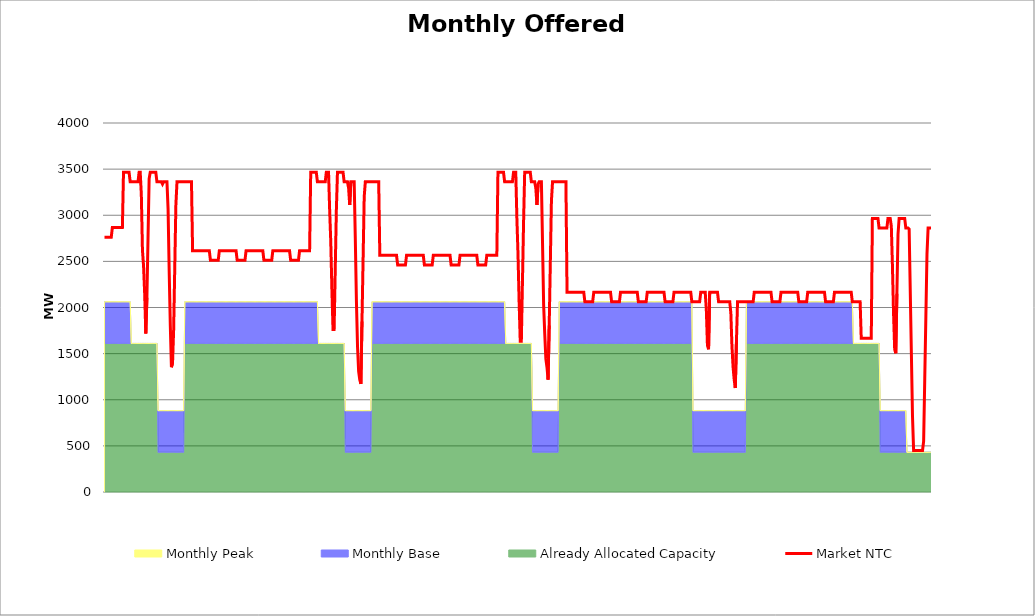
| Category | Market NTC |
|---|---|
| 0 | 2762 |
| 1 | 2762 |
| 2 | 2762 |
| 3 | 2762 |
| 4 | 2762 |
| 5 | 2762 |
| 6 | 2762 |
| 7 | 2866 |
| 8 | 2866 |
| 9 | 2866 |
| 10 | 2866 |
| 11 | 2866 |
| 12 | 2866 |
| 13 | 2866 |
| 14 | 2866 |
| 15 | 2866 |
| 16 | 2866 |
| 17 | 3466 |
| 18 | 3466 |
| 19 | 3466 |
| 20 | 3466 |
| 21 | 3466 |
| 22 | 3466 |
| 23 | 3362 |
| 24 | 3362 |
| 25 | 3362 |
| 26 | 3362 |
| 27 | 3362 |
| 28 | 3362 |
| 29 | 3362 |
| 30 | 3362 |
| 31 | 3466 |
| 32 | 3466 |
| 33 | 3224 |
| 34 | 2622 |
| 35 | 2450 |
| 36 | 2149 |
| 37 | 1719 |
| 38 | 2106 |
| 39 | 2751 |
| 40 | 3395 |
| 41 | 3466 |
| 42 | 3466 |
| 43 | 3466 |
| 44 | 3466 |
| 45 | 3466 |
| 46 | 3466 |
| 47 | 3362 |
| 48 | 3362 |
| 49 | 3362 |
| 50 | 3362 |
| 51 | 3362 |
| 52 | 3337 |
| 53 | 3362 |
| 54 | 3362 |
| 55 | 3362 |
| 56 | 3362 |
| 57 | 3066 |
| 58 | 2390 |
| 59 | 1804 |
| 60 | 1353 |
| 61 | 1398 |
| 62 | 1759 |
| 63 | 2435 |
| 64 | 3111 |
| 65 | 3362 |
| 66 | 3362 |
| 67 | 3362 |
| 68 | 3362 |
| 69 | 3362 |
| 70 | 3362 |
| 71 | 3362 |
| 72 | 3362 |
| 73 | 3362 |
| 74 | 3362 |
| 75 | 3362 |
| 76 | 3362 |
| 77 | 3362 |
| 78 | 3362 |
| 79 | 2616 |
| 80 | 2616 |
| 81 | 2616 |
| 82 | 2616 |
| 83 | 2616 |
| 84 | 2616 |
| 85 | 2616 |
| 86 | 2616 |
| 87 | 2616 |
| 88 | 2616 |
| 89 | 2616 |
| 90 | 2616 |
| 91 | 2616 |
| 92 | 2616 |
| 93 | 2616 |
| 94 | 2616 |
| 95 | 2512 |
| 96 | 2512 |
| 97 | 2512 |
| 98 | 2512 |
| 99 | 2512 |
| 100 | 2512 |
| 101 | 2512 |
| 102 | 2512 |
| 103 | 2616 |
| 104 | 2616 |
| 105 | 2616 |
| 106 | 2616 |
| 107 | 2616 |
| 108 | 2616 |
| 109 | 2616 |
| 110 | 2616 |
| 111 | 2616 |
| 112 | 2616 |
| 113 | 2616 |
| 114 | 2616 |
| 115 | 2616 |
| 116 | 2616 |
| 117 | 2616 |
| 118 | 2616 |
| 119 | 2512 |
| 120 | 2512 |
| 121 | 2512 |
| 122 | 2512 |
| 123 | 2512 |
| 124 | 2512 |
| 125 | 2512 |
| 126 | 2512 |
| 127 | 2616 |
| 128 | 2616 |
| 129 | 2616 |
| 130 | 2616 |
| 131 | 2616 |
| 132 | 2616 |
| 133 | 2616 |
| 134 | 2616 |
| 135 | 2616 |
| 136 | 2616 |
| 137 | 2616 |
| 138 | 2616 |
| 139 | 2616 |
| 140 | 2616 |
| 141 | 2616 |
| 142 | 2616 |
| 143 | 2512 |
| 144 | 2512 |
| 145 | 2512 |
| 146 | 2512 |
| 147 | 2512 |
| 148 | 2512 |
| 149 | 2512 |
| 150 | 2512 |
| 151 | 2616 |
| 152 | 2616 |
| 153 | 2616 |
| 154 | 2616 |
| 155 | 2616 |
| 156 | 2616 |
| 157 | 2616 |
| 158 | 2616 |
| 159 | 2616 |
| 160 | 2616 |
| 161 | 2616 |
| 162 | 2616 |
| 163 | 2616 |
| 164 | 2616 |
| 165 | 2616 |
| 166 | 2616 |
| 167 | 2512 |
| 168 | 2512 |
| 169 | 2512 |
| 170 | 2512 |
| 171 | 2512 |
| 172 | 2512 |
| 173 | 2512 |
| 174 | 2512 |
| 175 | 2616 |
| 176 | 2616 |
| 177 | 2616 |
| 178 | 2616 |
| 179 | 2616 |
| 180 | 2616 |
| 181 | 2616 |
| 182 | 2616 |
| 183 | 2616 |
| 184 | 2616 |
| 185 | 3466 |
| 186 | 3466 |
| 187 | 3466 |
| 188 | 3466 |
| 189 | 3466 |
| 190 | 3466 |
| 191 | 3362 |
| 192 | 3362 |
| 193 | 3362 |
| 194 | 3362 |
| 195 | 3362 |
| 196 | 3362 |
| 197 | 3362 |
| 198 | 3362 |
| 199 | 3466 |
| 200 | 3466 |
| 201 | 3466 |
| 202 | 3052 |
| 203 | 2708 |
| 204 | 2192 |
| 205 | 1762 |
| 206 | 1762 |
| 207 | 2407 |
| 208 | 3052 |
| 209 | 3466 |
| 210 | 3466 |
| 211 | 3466 |
| 212 | 3466 |
| 213 | 3466 |
| 214 | 3466 |
| 215 | 3362 |
| 216 | 3362 |
| 217 | 3362 |
| 218 | 3362 |
| 219 | 3292 |
| 220 | 3111 |
| 221 | 3362 |
| 222 | 3362 |
| 223 | 3362 |
| 224 | 3362 |
| 225 | 2751 |
| 226 | 2074 |
| 227 | 1578 |
| 228 | 1308 |
| 229 | 1218 |
| 230 | 1172 |
| 231 | 1849 |
| 232 | 2525 |
| 233 | 3201 |
| 234 | 3362 |
| 235 | 3362 |
| 236 | 3362 |
| 237 | 3362 |
| 238 | 3362 |
| 239 | 3362 |
| 240 | 3362 |
| 241 | 3362 |
| 242 | 3362 |
| 243 | 3362 |
| 244 | 3362 |
| 245 | 3362 |
| 246 | 3362 |
| 247 | 2566 |
| 248 | 2566 |
| 249 | 2566 |
| 250 | 2566 |
| 251 | 2566 |
| 252 | 2566 |
| 253 | 2566 |
| 254 | 2566 |
| 255 | 2566 |
| 256 | 2566 |
| 257 | 2566 |
| 258 | 2566 |
| 259 | 2566 |
| 260 | 2566 |
| 261 | 2566 |
| 262 | 2566 |
| 263 | 2462 |
| 264 | 2462 |
| 265 | 2462 |
| 266 | 2462 |
| 267 | 2462 |
| 268 | 2462 |
| 269 | 2462 |
| 270 | 2462 |
| 271 | 2566 |
| 272 | 2566 |
| 273 | 2566 |
| 274 | 2566 |
| 275 | 2566 |
| 276 | 2566 |
| 277 | 2566 |
| 278 | 2566 |
| 279 | 2566 |
| 280 | 2566 |
| 281 | 2566 |
| 282 | 2566 |
| 283 | 2566 |
| 284 | 2566 |
| 285 | 2566 |
| 286 | 2566 |
| 287 | 2462 |
| 288 | 2462 |
| 289 | 2462 |
| 290 | 2462 |
| 291 | 2462 |
| 292 | 2462 |
| 293 | 2462 |
| 294 | 2462 |
| 295 | 2566 |
| 296 | 2566 |
| 297 | 2566 |
| 298 | 2566 |
| 299 | 2566 |
| 300 | 2566 |
| 301 | 2566 |
| 302 | 2566 |
| 303 | 2566 |
| 304 | 2566 |
| 305 | 2566 |
| 306 | 2566 |
| 307 | 2566 |
| 308 | 2566 |
| 309 | 2566 |
| 310 | 2566 |
| 311 | 2462 |
| 312 | 2462 |
| 313 | 2462 |
| 314 | 2462 |
| 315 | 2462 |
| 316 | 2462 |
| 317 | 2462 |
| 318 | 2462 |
| 319 | 2566 |
| 320 | 2566 |
| 321 | 2566 |
| 322 | 2566 |
| 323 | 2566 |
| 324 | 2566 |
| 325 | 2566 |
| 326 | 2566 |
| 327 | 2566 |
| 328 | 2566 |
| 329 | 2566 |
| 330 | 2566 |
| 331 | 2566 |
| 332 | 2566 |
| 333 | 2566 |
| 334 | 2566 |
| 335 | 2462 |
| 336 | 2462 |
| 337 | 2462 |
| 338 | 2462 |
| 339 | 2462 |
| 340 | 2462 |
| 341 | 2462 |
| 342 | 2462 |
| 343 | 2566 |
| 344 | 2566 |
| 345 | 2566 |
| 346 | 2566 |
| 347 | 2566 |
| 348 | 2566 |
| 349 | 2566 |
| 350 | 2566 |
| 351 | 2566 |
| 352 | 2566 |
| 353 | 3466 |
| 354 | 3466 |
| 355 | 3466 |
| 356 | 3466 |
| 357 | 3466 |
| 358 | 3466 |
| 359 | 3362 |
| 360 | 3362 |
| 361 | 3362 |
| 362 | 3362 |
| 363 | 3362 |
| 364 | 3362 |
| 365 | 3362 |
| 366 | 3362 |
| 367 | 3466 |
| 368 | 3466 |
| 369 | 3466 |
| 370 | 2966 |
| 371 | 2579 |
| 372 | 2063 |
| 373 | 1633 |
| 374 | 1633 |
| 375 | 2278 |
| 376 | 2923 |
| 377 | 3466 |
| 378 | 3466 |
| 379 | 3466 |
| 380 | 3466 |
| 381 | 3466 |
| 382 | 3466 |
| 383 | 3362 |
| 384 | 3362 |
| 385 | 3362 |
| 386 | 3362 |
| 387 | 3292 |
| 388 | 3111 |
| 389 | 3337 |
| 390 | 3362 |
| 391 | 3362 |
| 392 | 3362 |
| 393 | 2706 |
| 394 | 2029 |
| 395 | 1714 |
| 396 | 1443 |
| 397 | 1353 |
| 398 | 1218 |
| 399 | 1804 |
| 400 | 2480 |
| 401 | 3157 |
| 402 | 3362 |
| 403 | 3362 |
| 404 | 3362 |
| 405 | 3362 |
| 406 | 3362 |
| 407 | 3362 |
| 408 | 3362 |
| 409 | 3362 |
| 410 | 3362 |
| 411 | 3362 |
| 412 | 3362 |
| 413 | 3362 |
| 414 | 3362 |
| 415 | 2166 |
| 416 | 2166 |
| 417 | 2166 |
| 418 | 2166 |
| 419 | 2166 |
| 420 | 2166 |
| 421 | 2166 |
| 422 | 2166 |
| 423 | 2166 |
| 424 | 2166 |
| 425 | 2166 |
| 426 | 2166 |
| 427 | 2166 |
| 428 | 2166 |
| 429 | 2166 |
| 430 | 2166 |
| 431 | 2062 |
| 432 | 2062 |
| 433 | 2062 |
| 434 | 2062 |
| 435 | 2062 |
| 436 | 2062 |
| 437 | 2062 |
| 438 | 2062 |
| 439 | 2166 |
| 440 | 2166 |
| 441 | 2166 |
| 442 | 2166 |
| 443 | 2166 |
| 444 | 2166 |
| 445 | 2166 |
| 446 | 2166 |
| 447 | 2166 |
| 448 | 2166 |
| 449 | 2166 |
| 450 | 2166 |
| 451 | 2166 |
| 452 | 2166 |
| 453 | 2166 |
| 454 | 2166 |
| 455 | 2062 |
| 456 | 2062 |
| 457 | 2062 |
| 458 | 2062 |
| 459 | 2062 |
| 460 | 2062 |
| 461 | 2062 |
| 462 | 2062 |
| 463 | 2166 |
| 464 | 2166 |
| 465 | 2166 |
| 466 | 2166 |
| 467 | 2166 |
| 468 | 2166 |
| 469 | 2166 |
| 470 | 2166 |
| 471 | 2166 |
| 472 | 2166 |
| 473 | 2166 |
| 474 | 2166 |
| 475 | 2166 |
| 476 | 2166 |
| 477 | 2166 |
| 478 | 2166 |
| 479 | 2062 |
| 480 | 2062 |
| 481 | 2062 |
| 482 | 2062 |
| 483 | 2062 |
| 484 | 2062 |
| 485 | 2062 |
| 486 | 2062 |
| 487 | 2166 |
| 488 | 2166 |
| 489 | 2166 |
| 490 | 2166 |
| 491 | 2166 |
| 492 | 2166 |
| 493 | 2166 |
| 494 | 2166 |
| 495 | 2166 |
| 496 | 2166 |
| 497 | 2166 |
| 498 | 2166 |
| 499 | 2166 |
| 500 | 2166 |
| 501 | 2166 |
| 502 | 2166 |
| 503 | 2062 |
| 504 | 2062 |
| 505 | 2062 |
| 506 | 2062 |
| 507 | 2062 |
| 508 | 2062 |
| 509 | 2062 |
| 510 | 2062 |
| 511 | 2166 |
| 512 | 2166 |
| 513 | 2166 |
| 514 | 2166 |
| 515 | 2166 |
| 516 | 2166 |
| 517 | 2166 |
| 518 | 2166 |
| 519 | 2166 |
| 520 | 2166 |
| 521 | 2166 |
| 522 | 2166 |
| 523 | 2166 |
| 524 | 2166 |
| 525 | 2166 |
| 526 | 2166 |
| 527 | 2062 |
| 528 | 2062 |
| 529 | 2062 |
| 530 | 2062 |
| 531 | 2062 |
| 532 | 2062 |
| 533 | 2062 |
| 534 | 2062 |
| 535 | 2166 |
| 536 | 2166 |
| 537 | 2166 |
| 538 | 2166 |
| 539 | 2166 |
| 540 | 1977 |
| 541 | 1590 |
| 542 | 1547 |
| 543 | 2166 |
| 544 | 2166 |
| 545 | 2166 |
| 546 | 2166 |
| 547 | 2166 |
| 548 | 2166 |
| 549 | 2166 |
| 550 | 2166 |
| 551 | 2062 |
| 552 | 2062 |
| 553 | 2062 |
| 554 | 2062 |
| 555 | 2062 |
| 556 | 2062 |
| 557 | 2062 |
| 558 | 2062 |
| 559 | 2062 |
| 560 | 2062 |
| 561 | 2062 |
| 562 | 1939 |
| 563 | 1578 |
| 564 | 1353 |
| 565 | 1218 |
| 566 | 1127 |
| 567 | 1623 |
| 568 | 2062 |
| 569 | 2062 |
| 570 | 2062 |
| 571 | 2062 |
| 572 | 2062 |
| 573 | 2062 |
| 574 | 2062 |
| 575 | 2062 |
| 576 | 2062 |
| 577 | 2062 |
| 578 | 2062 |
| 579 | 2062 |
| 580 | 2062 |
| 581 | 2062 |
| 582 | 2062 |
| 583 | 2166 |
| 584 | 2166 |
| 585 | 2166 |
| 586 | 2166 |
| 587 | 2166 |
| 588 | 2166 |
| 589 | 2166 |
| 590 | 2166 |
| 591 | 2166 |
| 592 | 2166 |
| 593 | 2166 |
| 594 | 2166 |
| 595 | 2166 |
| 596 | 2166 |
| 597 | 2166 |
| 598 | 2166 |
| 599 | 2062 |
| 600 | 2062 |
| 601 | 2062 |
| 602 | 2062 |
| 603 | 2062 |
| 604 | 2062 |
| 605 | 2062 |
| 606 | 2062 |
| 607 | 2166 |
| 608 | 2166 |
| 609 | 2166 |
| 610 | 2166 |
| 611 | 2166 |
| 612 | 2166 |
| 613 | 2166 |
| 614 | 2166 |
| 615 | 2166 |
| 616 | 2166 |
| 617 | 2166 |
| 618 | 2166 |
| 619 | 2166 |
| 620 | 2166 |
| 621 | 2166 |
| 622 | 2166 |
| 623 | 2062 |
| 624 | 2062 |
| 625 | 2062 |
| 626 | 2062 |
| 627 | 2062 |
| 628 | 2062 |
| 629 | 2062 |
| 630 | 2062 |
| 631 | 2166 |
| 632 | 2166 |
| 633 | 2166 |
| 634 | 2166 |
| 635 | 2166 |
| 636 | 2166 |
| 637 | 2166 |
| 638 | 2166 |
| 639 | 2166 |
| 640 | 2166 |
| 641 | 2166 |
| 642 | 2166 |
| 643 | 2166 |
| 644 | 2166 |
| 645 | 2166 |
| 646 | 2166 |
| 647 | 2062 |
| 648 | 2062 |
| 649 | 2062 |
| 650 | 2062 |
| 651 | 2062 |
| 652 | 2062 |
| 653 | 2062 |
| 654 | 2062 |
| 655 | 2166 |
| 656 | 2166 |
| 657 | 2166 |
| 658 | 2166 |
| 659 | 2166 |
| 660 | 2166 |
| 661 | 2166 |
| 662 | 2166 |
| 663 | 2166 |
| 664 | 2166 |
| 665 | 2166 |
| 666 | 2166 |
| 667 | 2166 |
| 668 | 2166 |
| 669 | 2166 |
| 670 | 2166 |
| 671 | 2062 |
| 672 | 2062 |
| 673 | 2062 |
| 674 | 2062 |
| 675 | 2062 |
| 676 | 2062 |
| 677 | 2062 |
| 678 | 2062 |
| 679 | 1666 |
| 680 | 1666 |
| 681 | 1666 |
| 682 | 1666 |
| 683 | 1666 |
| 684 | 1666 |
| 685 | 1666 |
| 686 | 1666 |
| 687 | 1666 |
| 688 | 1666 |
| 689 | 2966 |
| 690 | 2966 |
| 691 | 2966 |
| 692 | 2966 |
| 693 | 2966 |
| 694 | 2966 |
| 695 | 2862 |
| 696 | 2862 |
| 697 | 2862 |
| 698 | 2862 |
| 699 | 2862 |
| 700 | 2862 |
| 701 | 2862 |
| 702 | 2862 |
| 703 | 2966 |
| 704 | 2966 |
| 705 | 2966 |
| 706 | 2880 |
| 707 | 2450 |
| 708 | 1934 |
| 709 | 1547 |
| 710 | 1504 |
| 711 | 2149 |
| 712 | 2794 |
| 713 | 2966 |
| 714 | 2966 |
| 715 | 2966 |
| 716 | 2966 |
| 717 | 2966 |
| 718 | 2966 |
| 719 | 2862 |
| 720 | 2862 |
| 721 | 2862 |
| 722 | 2850 |
| 723 | 2174 |
| 724 | 1497 |
| 725 | 821 |
| 726 | 451 |
| 727 | 451 |
| 728 | 451 |
| 729 | 451 |
| 730 | 451 |
| 731 | 451 |
| 732 | 451 |
| 733 | 451 |
| 734 | 451 |
| 735 | 550 |
| 736 | 1227 |
| 737 | 1903 |
| 738 | 2579 |
| 739 | 2862 |
| 740 | 2862 |
| 741 | 2862 |
| 742 | 2862 |